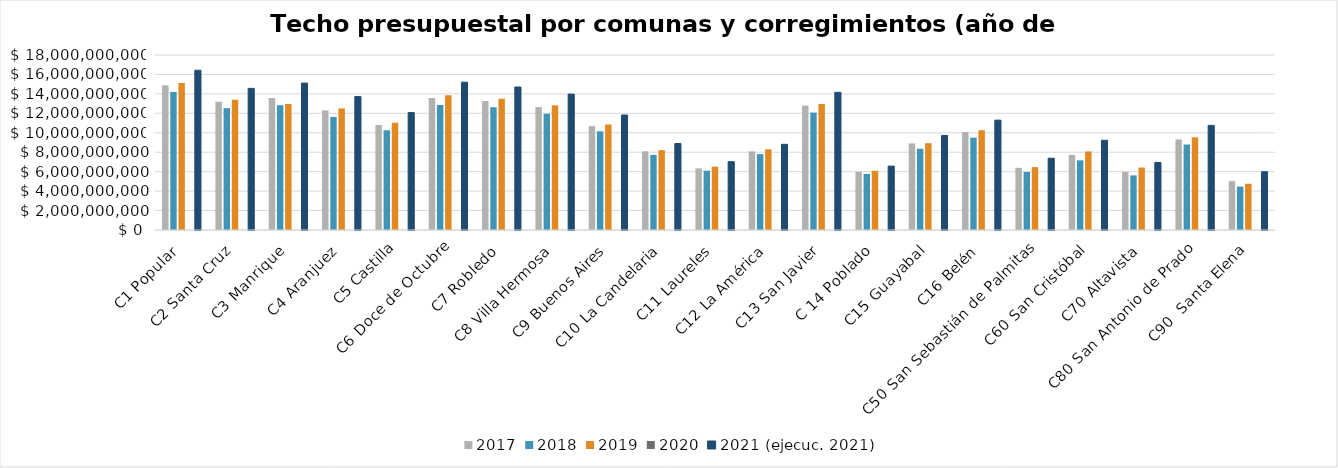
| Category | 2017 | 2018 | 2019 | 2020 | 2021 (ejecuc. 2021) |
|---|---|---|---|---|---|
| C1 Popular | 14898328963 | 14201330967 | 15132784639 |  | 16435738982 |
| C2 Santa Cruz | 13184287830 | 12530956523 | 13390918142 |  | 14566251883 |
| C3 Manrique | 13567167386 | 12835286413 | 12963971557 |  | 15109742551 |
| C4 Aranjuez | 12296244477 | 11629012165 | 12506686113 |  | 13723958233 |
| C5 Castilla | 10792665830 | 10260706641 | 11038569814 |  | 12074571967 |
| C6 Doce de Octubre | 13576774511 | 12857626508 | 13869341570 |  | 15207140415 |
| C7 Robledo | 13277678121 | 12629394927 | 13504006068 |  | 14709000349 |
| C8 Villa Hermosa | 12635247234 | 11954953179 | 12818041548 |  | 13980188162 |
| C9 Buenos Aires | 10679638997 | 10154592634 | 10851650236 |  | 11827266561 |
| C10 La Candelaria | 8093504927 | 7724454484 | 8215250660 |  | 8896857688 |
| C11 Laureles | 6336784840 | 6097598330 | 6516968803 |  | 7025104089 |
| C12 La América | 8082246389 | 7805460302 | 8299851790 |  | 8812724993 |
| C13 San Javier | 12795197430 | 12076727167 | 12963971557 |  | 14165805569 |
| C 14 Poblado | 5995313734 | 5759719010 | 6092698069 |  | 6570822458 |
| C15 Guayabal | 8904960315 | 8362787971 | 8930753649 |  | 9729057810 |
| C16 Belén | 10076126711 | 9496969305 | 10259554716 |  | 11302498074 |
| C50 San Sebastián de Palmitas  | 6398376404 | 5971350259 | 6464357220 |  | 7383763937 |
| C60 San Cristóbal | 7731394140 | 7165758522 | 8082232236 |  | 9225271899 |
| C70 Altavista | 5981456620 | 5615228348 | 6423017238 |  | 6950790911 |
| C80 San Antonio de Prado | 9312214586 | 8792935166 | 9534628954 |  | 10759996901 |
| C90  Santa Elena | 5023241793 | 4462972803 | 4760495004 |  | 5992784302 |